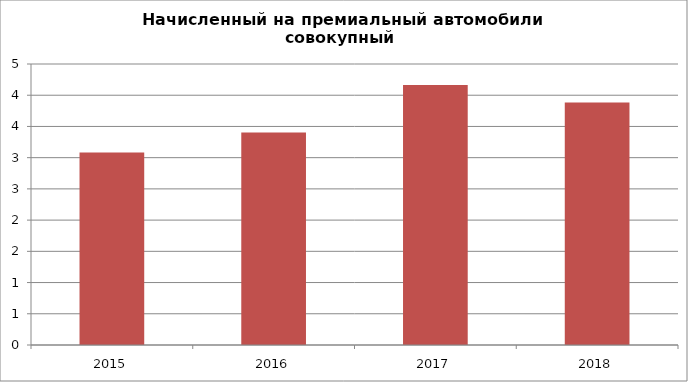
| Category | Начисленный транспортный налог |
|---|---|
| 2015.0 | 3.084 |
| 2016.0 | 3.405 |
| 2017.0 | 4.165 |
| 2018.0 | 3.882 |